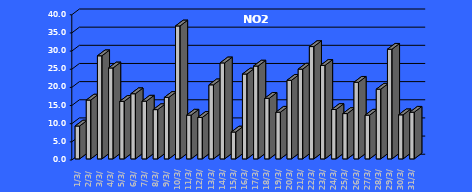
| Category | NO2 [µg/m3] |
|---|---|
| 2023-03-01 | 9.057 |
| 2023-03-02 | 16.207 |
| 2023-03-03 | 28.398 |
| 2023-03-04 | 25.044 |
| 2023-03-05 | 15.846 |
| 2023-03-06 | 17.946 |
| 2023-03-07 | 15.911 |
| 2023-03-08 | 13.569 |
| 2023-03-09 | 16.939 |
| 2023-03-10 | 36.618 |
| 2023-03-11 | 12.05 |
| 2023-03-12 | 11.42 |
| 2023-03-13 | 20.398 |
| 2023-03-14 | 26.439 |
| 2023-03-15 | 7.399 |
| 2023-03-16 | 23.376 |
| 2023-03-17 | 25.567 |
| 2023-03-18 | 16.688 |
| 2023-03-19 | 12.856 |
| 2023-03-20 | 21.653 |
| 2023-03-21 | 24.729 |
| 2023-03-22 | 30.935 |
| 2023-03-23 | 25.75 |
| 2023-03-24 | 13.601 |
| 2023-03-25 | 12.483 |
| 2023-03-26 | 21.106 |
| 2023-03-27 | 12.048 |
| 2023-03-28 | 19.201 |
| 2023-03-29 | 30.204 |
| 2023-03-30 | 12.138 |
| 2023-03-31 | 12.855 |